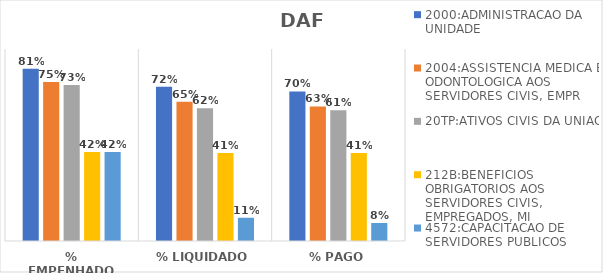
| Category | 2000:ADMINISTRACAO DA UNIDADE | 2004:ASSISTENCIA MEDICA E ODONTOLOGICA AOS SERVIDORES CIVIS, EMPR | 20TP:ATIVOS CIVIS DA UNIAO | 212B:BENEFICIOS OBRIGATORIOS AOS SERVIDORES CIVIS, EMPREGADOS, MI | 4572:CAPACITACAO DE SERVIDORES PUBLICOS FEDERAIS EM PROCESSO DE Q |
|---|---|---|---|---|---|
| % EMPENHADO | 0.808 | 0.745 | 0.731 | 0.417 | 0.417 |
| % LIQUIDADO | 0.723 | 0.653 | 0.622 | 0.412 | 0.109 |
| % PAGO | 0.701 | 0.631 | 0.613 | 0.412 | 0.084 |